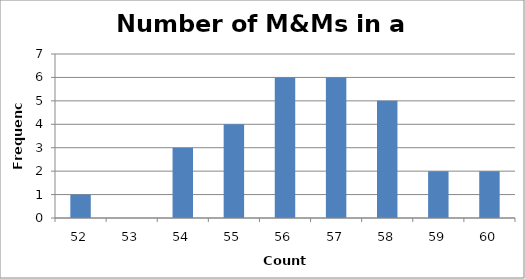
| Category | Series 0 |
|---|---|
| 52.0 | 1 |
| 53.0 | 0 |
| 54.0 | 3 |
| 55.0 | 4 |
| 56.0 | 6 |
| 57.0 | 6 |
| 58.0 | 5 |
| 59.0 | 2 |
| 60.0 | 2 |